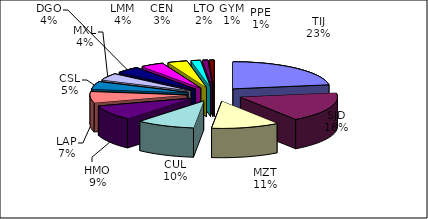
| Category | Series 0 |
|---|---|
| TIJ | 46763 |
| SJD | 36733 |
| MZT | 23414 |
| CUL | 20166 |
| HMO | 18551 |
| LAP | 13671 |
| CSL | 9459 |
| MXL | 8415 |
| DGO | 8367 |
| LMM | 7930 |
| CEN | 6778 |
| LTO | 3202 |
| GYM | 1817 |
| PPE | 1622 |